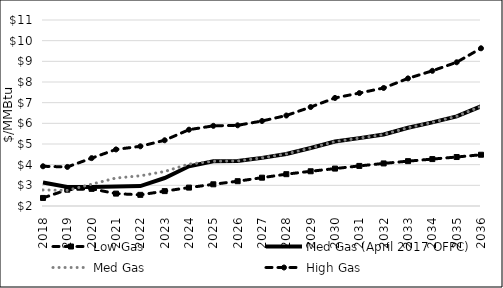
| Category | Low Gas | Med Gas (April 2017 OFPC) | Med Gas | High Gas |
|---|---|---|---|---|
| 2018.0 | 2.39 | 3.139 | 2.777 | 3.922 |
| 2019.0 | 2.79 | 2.92 | 2.756 | 3.89 |
| 2020.0 | 2.83 | 2.92 | 3.057 | 4.316 |
| 2021.0 | 2.6 | 2.94 | 3.353 | 4.738 |
| 2022.0 | 2.54 | 2.965 | 3.461 | 4.888 |
| 2023.0 | 2.72 | 3.354 | 3.669 | 5.181 |
| 2024.0 | 2.89 | 3.92 | 4.029 | 5.692 |
| 2025.0 | 3.05 | 4.162 | 4.163 | 5.879 |
| 2026.0 | 3.2 | 4.179 | 4.18 | 5.905 |
| 2027.0 | 3.37 | 4.329 | 4.33 | 6.113 |
| 2028.0 | 3.54 | 4.519 | 4.518 | 6.379 |
| 2029.0 | 3.68 | 4.806 | 4.806 | 6.789 |
| 2030.0 | 3.81 | 5.117 | 5.117 | 7.229 |
| 2031.0 | 3.94 | 5.284 | 5.284 | 7.464 |
| 2032.0 | 4.06 | 5.459 | 5.459 | 7.711 |
| 2033.0 | 4.17 | 5.787 | 5.787 | 8.174 |
| 2034.0 | 4.27 | 6.047 | 6.048 | 8.541 |
| 2035.0 | 4.37 | 6.339 | 6.339 | 8.955 |
| 2036.0 | 4.48 | 6.823 | 6.822 | 9.631 |